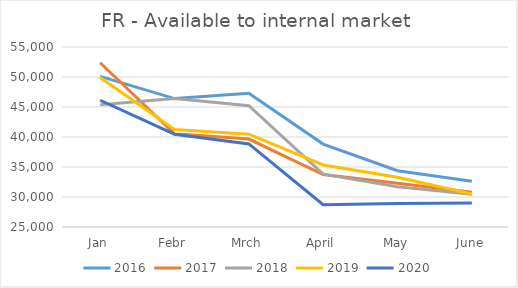
| Category | 2016 | 2017 | 2018 | 2019 | 2020 |
|---|---|---|---|---|---|
| Jan | 50101 | 52369.482 | 45390.159 | 49913.379 | 46126.456 |
| Febr | 46402 | 40523.681 | 46414.117 | 41263.973 | 40469.252 |
| Mrch | 47294 | 39660.507 | 45215.895 | 40465.138 | 38847.425 |
| April | 38817 | 33734.991 | 33800.242 | 35335.46 | 28711.58 |
| May | 34383 | 32294.99 | 31700.225 | 33301.108 | 28915.734 |
| June | 32627 | 30798.969 | 30448.264 | 30494.332 | 28992.308 |